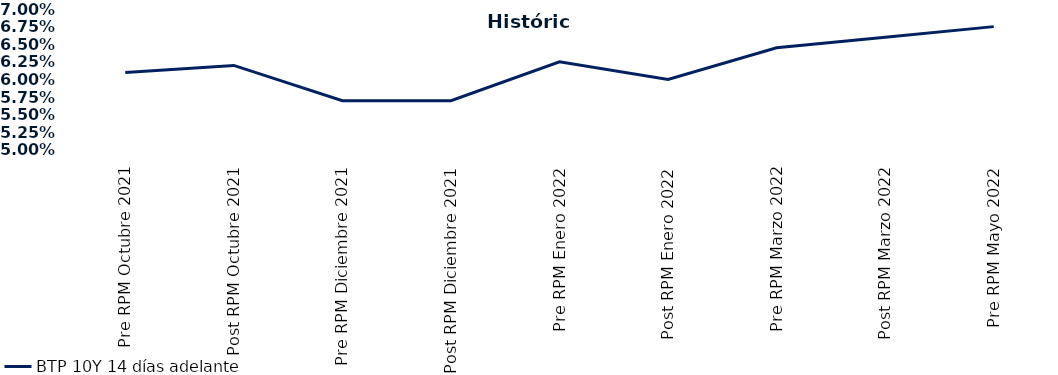
| Category | BTP 10Y 14 días adelante |
|---|---|
| Pre RPM Octubre 2021 | 0.061 |
| Post RPM Octubre 2021 | 0.062 |
| Pre RPM Diciembre 2021 | 0.057 |
| Post RPM Diciembre 2021 | 0.057 |
| Pre RPM Enero 2022 | 0.062 |
| Post RPM Enero 2022 | 0.06 |
| Pre RPM Marzo 2022 | 0.064 |
| Post RPM Marzo 2022 | 0.066 |
| Pre RPM Mayo 2022 | 0.068 |